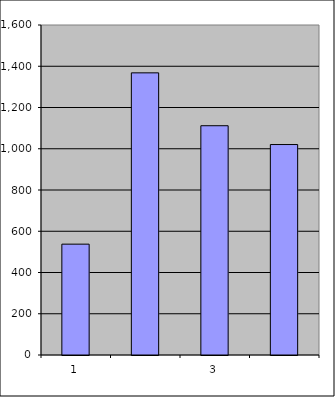
| Category | Series 0 |
|---|---|
| 0 | 537.5 |
| 1 | 1367.979 |
| 2 | 1111.654 |
| 3 | 1020.42 |